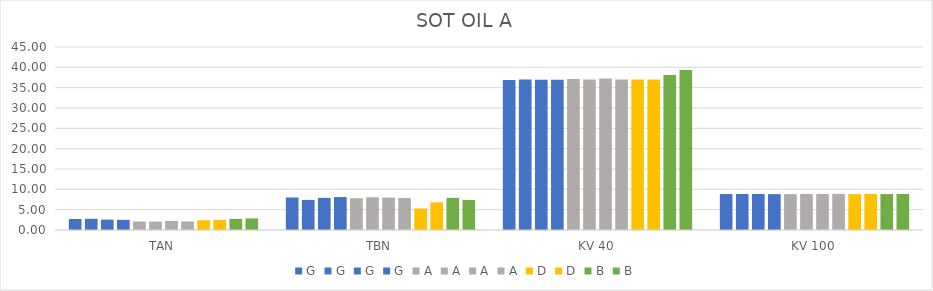
| Category | G | A | D | B |
|---|---|---|---|---|
| TAN | 2.5 | 2.1 | 2.5 | 2.85 |
| TBN | 8.1 | 7.85 | 6.8 | 7.4 |
| KV 40 | 36.92 | 36.98 | 37 | 39.36 |
| KV 100 | 8.82 | 8.89 | 8.88 | 8.85 |